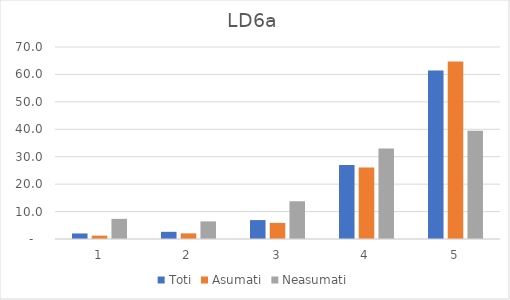
| Category | Toti | Asumati | Neasumati |
|---|---|---|---|
| 0 | 2.021 | 1.23 | 7.339 |
| 1 | 2.616 | 2.049 | 6.422 |
| 2 | 6.897 | 5.874 | 13.761 |
| 3 | 26.992 | 26.093 | 33.028 |
| 4 | 61.474 | 64.754 | 39.45 |